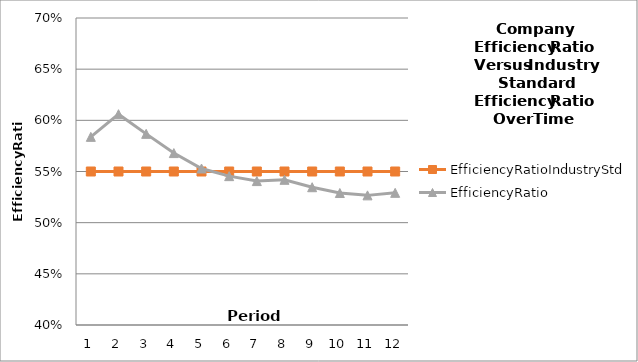
| Category | EfficiencyRatioIndustryStd | EfficiencyRatio |
|---|---|---|
| 0 | 0.55 | 0.584 |
| 1 | 0.55 | 0.606 |
| 2 | 0.55 | 0.587 |
| 3 | 0.55 | 0.568 |
| 4 | 0.55 | 0.553 |
| 5 | 0.55 | 0.545 |
| 6 | 0.55 | 0.541 |
| 7 | 0.55 | 0.542 |
| 8 | 0.55 | 0.535 |
| 9 | 0.55 | 0.529 |
| 10 | 0.55 | 0.527 |
| 11 | 0.55 | 0.529 |